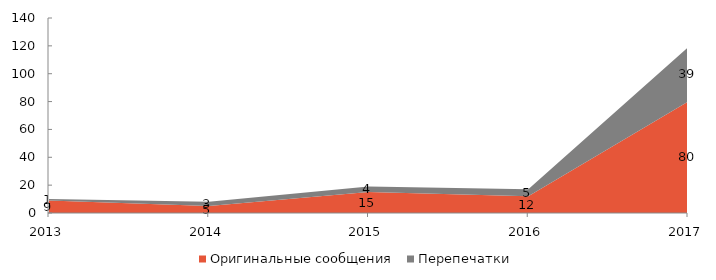
| Category | Оригинальные сообщения | Перепечатки |
|---|---|---|
| 2013 | 9 | 1 |
| 2014 | 5 | 3 |
| 2015 | 15 | 4 |
| 2016 | 12 | 5 |
| 2017 | 80 | 39 |